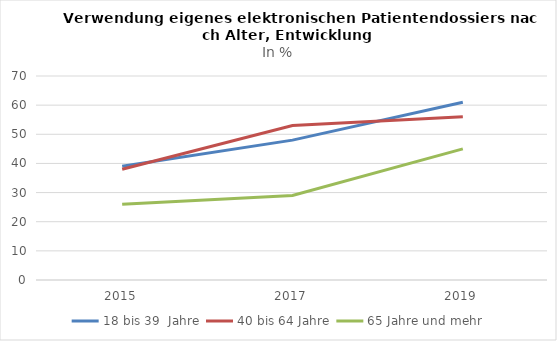
| Category | 18 bis 39  Jahre | 40 bis 64 Jahre | 65 Jahre und mehr |
|---|---|---|---|
| 2015.0 | 39 | 38 | 26 |
| 2017.0 | 48 | 53 | 29 |
| 2019.0 | 61 | 56 | 45 |